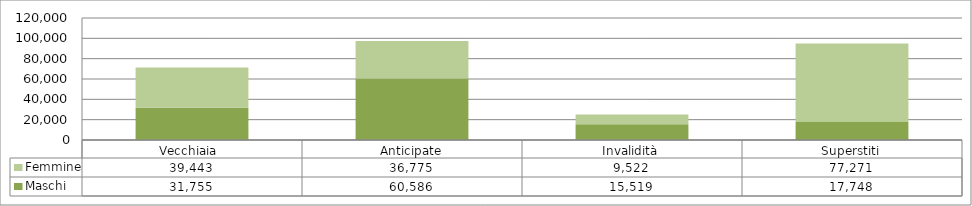
| Category | Maschi | Femmine |
|---|---|---|
| Vecchiaia  | 31755 | 39443 |
| Anticipate | 60586 | 36775 |
| Invalidità | 15519 | 9522 |
| Superstiti | 17748 | 77271 |